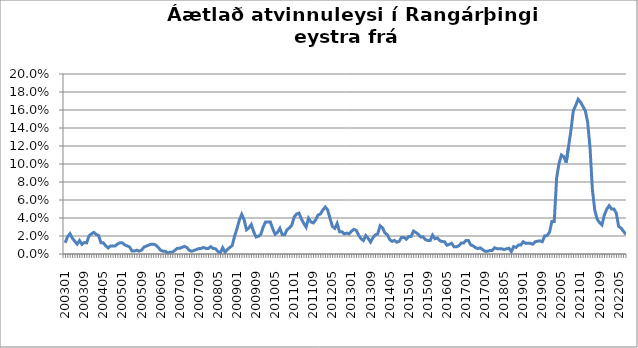
| Category | Series 0 |
|---|---|
| 200301 | 0.012 |
| 200302 | 0.019 |
| 200303 | 0.023 |
| 200304 | 0.018 |
| 200305 | 0.014 |
| 200306 | 0.011 |
| 200307 | 0.015 |
| 200308 | 0.011 |
| 200309 | 0.013 |
| 200310 | 0.012 |
| 200311 | 0.02 |
| 200312 | 0.022 |
| 200401 | 0.024 |
| 200402 | 0.022 |
| 200403 | 0.021 |
| 200404 | 0.012 |
| 200405 | 0.012 |
| 200406 | 0.009 |
| 200407 | 0.007 |
| 200408 | 0.009 |
| 200409 | 0.009 |
| 200410 | 0.009 |
| 200411 | 0.011 |
| 200412 | 0.012 |
| 200501 | 0.012 |
| 200502 | 0.01 |
| 200503 | 0.009 |
| 200504 | 0.008 |
| 200505 | 0.003 |
| 200506 | 0.003 |
| 200507 | 0.004 |
| 200508 | 0.003 |
| 200509 | 0.004 |
| 200510 | 0.008 |
| 200511 | 0.009 |
| 200512 | 0.01 |
| 200601 | 0.011 |
| 200602 | 0.011 |
| 200603 | 0.01 |
| 200604 | 0.007 |
| 200605 | 0.004 |
| 200606 | 0.003 |
| 200607 | 0.003 |
| 200608 | 0.001 |
| 200609 | 0.002 |
| 200610 | 0.002 |
| 200611 | 0.004 |
| 200612 | 0.006 |
| 200701 | 0.006 |
| 200702 | 0.007 |
| 200703 | 0.008 |
| 200704 | 0.007 |
| 200705 | 0.004 |
| 200706 | 0.003 |
| 200707 | 0.004 |
| 200708 | 0.005 |
| 200709 | 0.006 |
| 200710 | 0.006 |
| 200711 | 0.007 |
| 200712 | 0.006 |
| 200801 | 0.006 |
| 200802 | 0.008 |
| 200803 | 0.006 |
| 200804 | 0.006 |
| 200805 | 0.003 |
| 200806 | 0.001 |
| 200807 | 0.007 |
| 200808 | 0.002 |
| 200809 | 0.005 |
| 200810 | 0.007 |
| 200811 | 0.009 |
| 200812 | 0.02 |
| 200901 | 0.028 |
| 200902 | 0.038 |
| 200903 | 0.044 |
| 200904 | 0.038 |
| 200905 | 0.027 |
| 200906 | 0.029 |
| 200907 | 0.033 |
| 200908 | 0.025 |
| 200909 | 0.019 |
| 200910 | 0.02 |
| 200911 | 0.022 |
| 200912 | 0.03 |
| 201001 | 0.036 |
| 201002 | 0.036 |
| 201003 | 0.036 |
| 201004 | 0.028 |
| 201005 | 0.022 |
| 201006 | 0.024 |
| 201007 | 0.029 |
| 201008 | 0.021 |
| 201009 | 0.021 |
| 201010 | 0.027 |
| 201011 | 0.029 |
| 201012 | 0.032 |
| 201101 | 0.041 |
| 201102 | 0.044 |
| 201103 | 0.045 |
| 201104 | 0.039 |
| 201105 | 0.034 |
| 201106 | 0.03 |
| 201107 | 0.04 |
| 201108 | 0.036 |
| 201109 | 0.035 |
| 201110 | 0.038 |
| 201111 | 0.043 |
| 201112 | 0.044 |
| 201201 | 0.049 |
| 201202 | 0.052 |
| 201203 | 0.049 |
| 201204 | 0.04 |
| 201205 | 0.031 |
| 201206 | 0.029 |
| 201207 | 0.034 |
| 201208 | 0.025 |
| 201209 | 0.025 |
| 201210 | 0.022 |
| 201211 | 0.023 |
| 201212 | 0.022 |
| 201301 | 0.025 |
| 201302 | 0.027 |
| 201303 | 0.026 |
| 201304 | 0.021 |
| 201305 | 0.017 |
| 201306 | 0.015 |
| 201307 | 0.02 |
| 201308 | 0.017 |
| 201309 | 0.013 |
| 201310 | 0.018 |
| 201311 | 0.021 |
| 201312 | 0.022 |
| 201401 | 0.031 |
| 201402 | 0.029 |
| 201403 | 0.024 |
| 201404 | 0.022 |
| 201405 | 0.016 |
| 201406 | 0.014 |
| 201407 | 0.015 |
| 201408 | 0.013 |
| 201409 | 0.014 |
| 201410 | 0.018 |
| 201411 | 0.018 |
| 201412 | 0.016 |
| 201501 | 0.019 |
| 201502 | 0.019 |
| 201503 | 0.026 |
| 201504 | 0.024 |
| 201505 | 0.022 |
| 201506 | 0.019 |
| 201507 | 0.019 |
| 201508 | 0.016 |
| 201509 | 0.015 |
| 201510 | 0.015 |
| 201511 | 0.021 |
| 201512 | 0.017 |
| 201601 | 0.018 |
| 201602 | 0.015 |
| 201603 | 0.014 |
| 201604 | 0.014 |
| 201605 | 0.01 |
| 201606 | 0.011 |
| 201607 | 0.012 |
| 201608 | 0.008 |
| 201609 | 0.008 |
| 201610 | 0.009 |
| 201611 | 0.012 |
| 201612 | 0.012 |
| 201701 | 0.015 |
| 201702 | 0.015 |
| 201703 | 0.01 |
| 201704 | 0.009 |
| 201705 | 0.007 |
| 201706 | 0.006 |
| 201707 | 0.007 |
| 201708 | 0.005 |
| 201709 | 0.003 |
| 201710 | 0.003 |
| 201711 | 0.004 |
| 201712 | 0.004 |
| 201801 | 0.007 |
| 201802 | 0.006 |
| 201803 | 0.006 |
| 201804 | 0.006 |
| 201805 | 0.005 |
| 201806 | 0.006 |
| 201807 | 0.006 |
| 201808 | 0.003 |
| 201809 | 0.008 |
| 201810 | 0.007 |
| 201811 | 0.01 |
| 201812 | 0.01 |
| 201901 | 0.014 |
| 201902 | 0.012 |
| 201903 | 0.012 |
| 201904 | 0.012 |
| 201905 | 0.011 |
| 201906 | 0.014 |
| 201907 | 0.014 |
| 201908 | 0.015 |
| 201909 | 0.014 |
| 201910 | 0.02 |
| 201911 | 0.02 |
| 201912 | 0.024 |
| 202001 | 0.036 |
| 202002 | 0.036 |
| 202003 | 0.084 |
| 202004 | 0.1 |
| 202005 | 0.11 |
| 202006 | 0.108 |
| 202007 | 0.101 |
| 202008 | 0.119 |
| 202009 | 0.137 |
| 202010 | 0.159 |
| 202011 | 0.165 |
| 202012 | 0.172 |
| 202101 | 0.169 |
| 202102 | 0.164 |
| 202103 | 0.159 |
| 202104 | 0.146 |
| 202105 | 0.118 |
| 202106 | 0.071 |
| 202107 | 0.049 |
| 202108 | 0.039 |
| 202109 | 0.035 |
| 202110 | 0.032 |
| 202111 | 0.043 |
| 202112 | 0.05 |
| 202201 | 0.054 |
| 202202 | 0.05 |
| 202203 | 0.05 |
| 202204 | 0.045 |
| 202205 | 0.031 |
| 202206 | 0.029 |
| 202207 | 0.025 |
| 202208 | 0.022 |